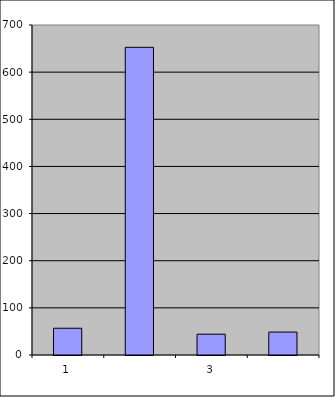
| Category | Series 0 |
|---|---|
| 0 | 56.75 |
| 1 | 652.651 |
| 2 | 44.115 |
| 3 | 48.649 |